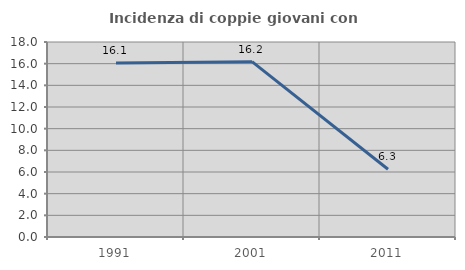
| Category | Incidenza di coppie giovani con figli |
|---|---|
| 1991.0 | 16.064 |
| 2001.0 | 16.183 |
| 2011.0 | 6.25 |